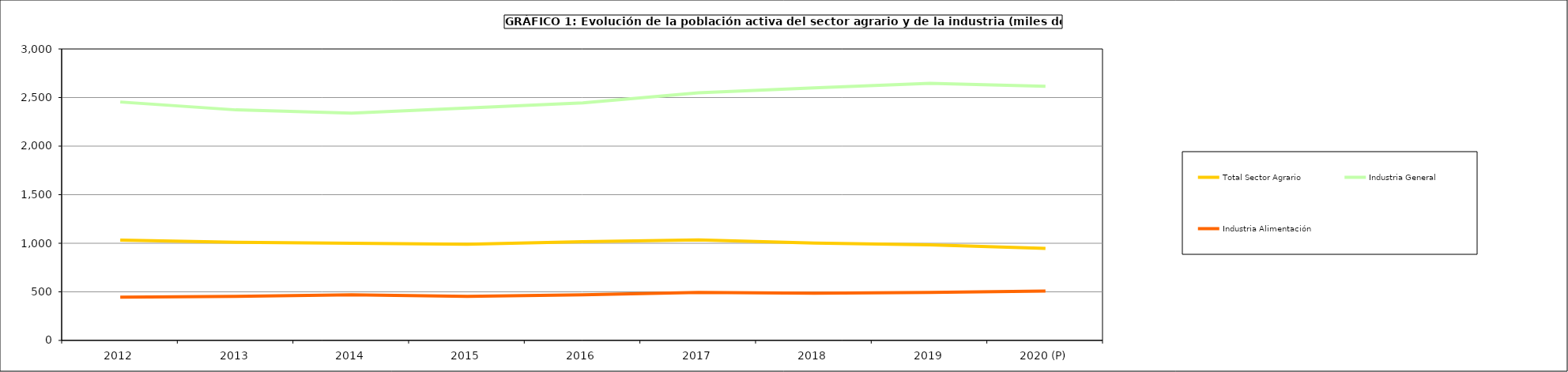
| Category | Total Sector Agrario | Industria General | Industria Alimentación |
|---|---|---|---|
| 2012 | 1032.125 | 2454.25 | 445.725 |
| 2013 | 1010.5 | 2372.975 | 454.075 |
| 2014 | 1000.9 | 2339.7 | 468.5 |
| 2015 | 990.325 | 2391.725 | 454.1 |
| 2016 | 1016.75 | 2445.73 | 468.93 |
| 2017 | 1034 | 2548.2 | 494.3 |
| 2018 | 1002.675 | 2599.175 | 485.3 |
| 2019 | 983.3 | 2646.575 | 493.625 |
| 2020 (P) | 946.6 | 2616.8 | 508.9 |